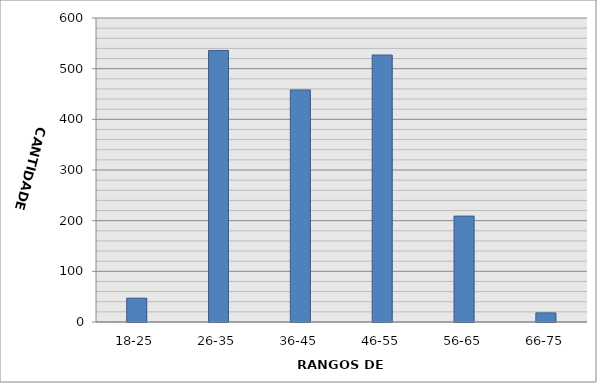
| Category | Series 0 |
|---|---|
| 18-25 | 47 |
| 26-35 | 536 |
| 36-45 | 458 |
| 46-55 | 527 |
| 56-65 | 209 |
| 66-75 | 18 |